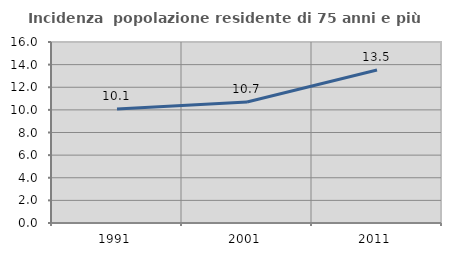
| Category | Incidenza  popolazione residente di 75 anni e più |
|---|---|
| 1991.0 | 10.088 |
| 2001.0 | 10.693 |
| 2011.0 | 13.528 |